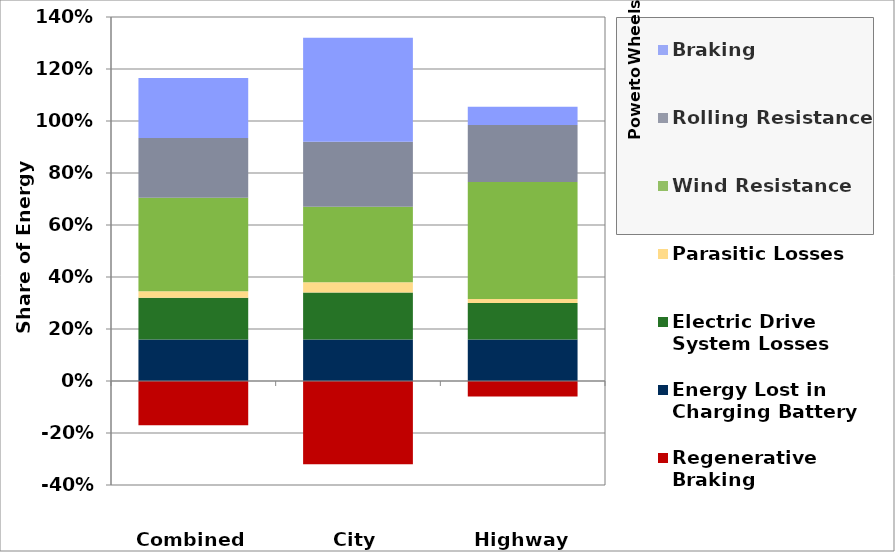
| Category | Regenerative Braking  | Energy Lost in Charging Battery | Electric Drive System Losses | Parasitic Losses | Wind Resistance | Rolling Resistance | Braking |
|---|---|---|---|---|---|---|---|
| Combined | -0.17 | 0.16 | 0.16 | 0.025 | 0.36 | 0.23 | 0.23 |
| City | -0.32 | 0.16 | 0.18 | 0.04 | 0.29 | 0.25 | 0.4 |
| Highway | -0.06 | 0.16 | 0.14 | 0.015 | 0.45 | 0.22 | 0.07 |